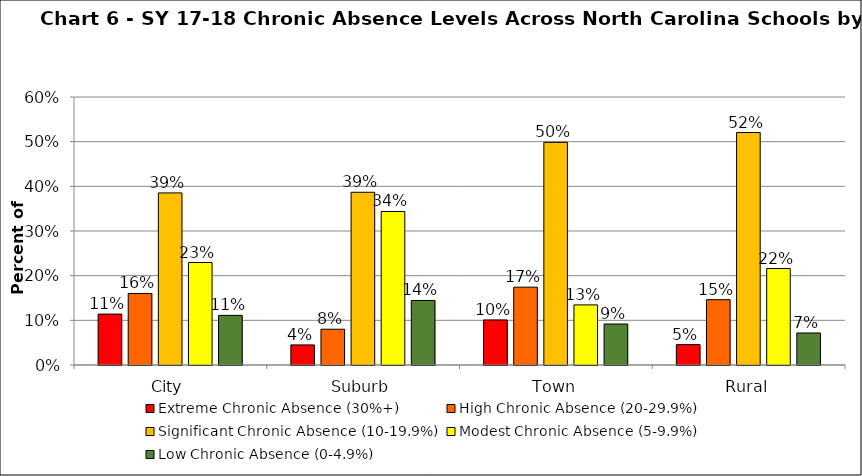
| Category | Extreme Chronic Absence (30%+) | High Chronic Absence (20-29.9%) | Significant Chronic Absence (10-19.9%) | Modest Chronic Absence (5-9.9%) | Low Chronic Absence (0-4.9%) |
|---|---|---|---|---|---|
| 0 | 0.114 | 0.16 | 0.385 | 0.229 | 0.111 |
| 1 | 0.045 | 0.08 | 0.387 | 0.344 | 0.145 |
| 2 | 0.101 | 0.174 | 0.498 | 0.135 | 0.092 |
| 3 | 0.046 | 0.146 | 0.52 | 0.216 | 0.072 |